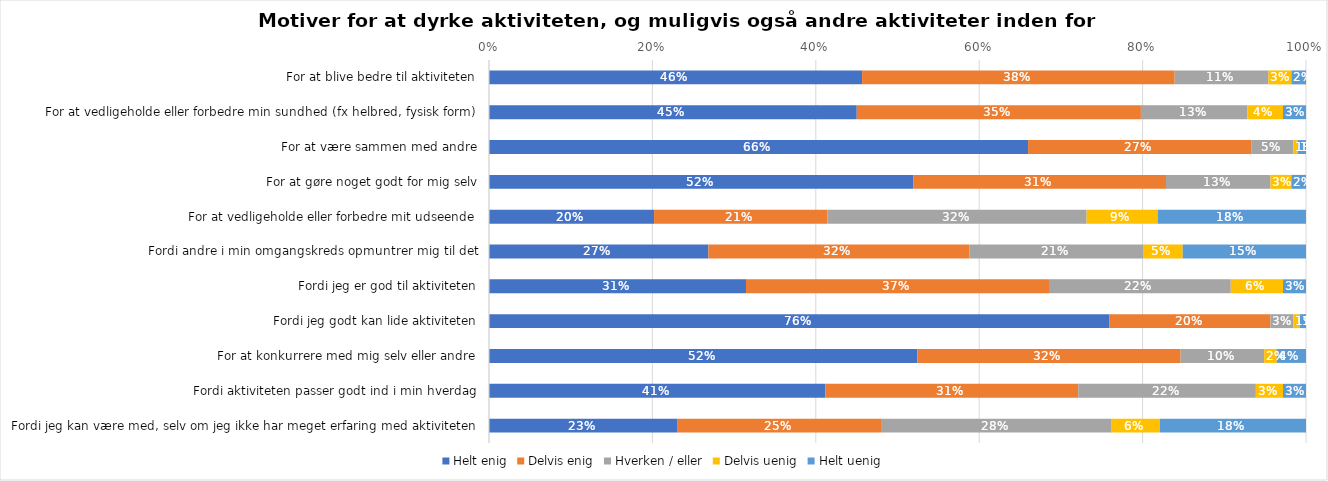
| Category | Helt enig | Delvis enig | Hverken / eller | Delvis uenig | Helt uenig |
|---|---|---|---|---|---|
| For at blive bedre til aktiviteten | 0.457 | 0.383 | 0.115 | 0.028 | 0.018 |
| For at vedligeholde eller forbedre min sundhed (fx helbred, fysisk form) | 0.45 | 0.348 | 0.13 | 0.043 | 0.028 |
| For at være sammen med andre | 0.66 | 0.274 | 0.051 | 0.005 | 0.01 |
| For at gøre noget godt for mig selv | 0.519 | 0.309 | 0.128 | 0.026 | 0.018 |
| For at vedligeholde eller forbedre mit udseende | 0.202 | 0.212 | 0.317 | 0.087 | 0.182 |
| Fordi andre i min omgangskreds opmuntrer mig til det | 0.269 | 0.32 | 0.212 | 0.049 | 0.151 |
| Fordi jeg er god til aktiviteten | 0.315 | 0.371 | 0.223 | 0.064 | 0.028 |
| Fordi jeg godt kan lide aktiviteten | 0.76 | 0.197 | 0.028 | 0.008 | 0.008 |
| For at konkurrere med mig selv eller andre | 0.524 | 0.322 | 0.102 | 0.015 | 0.036 |
| Fordi aktiviteten passer godt ind i min hverdag | 0.412 | 0.309 | 0.217 | 0.033 | 0.028 |
| Fordi jeg kan være med, selv om jeg ikke har meget erfaring med aktiviteten | 0.23 | 0.251 | 0.281 | 0.059 | 0.179 |